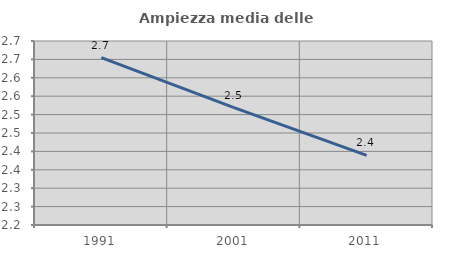
| Category | Ampiezza media delle famiglie |
|---|---|
| 1991.0 | 2.655 |
| 2001.0 | 2.519 |
| 2011.0 | 2.389 |